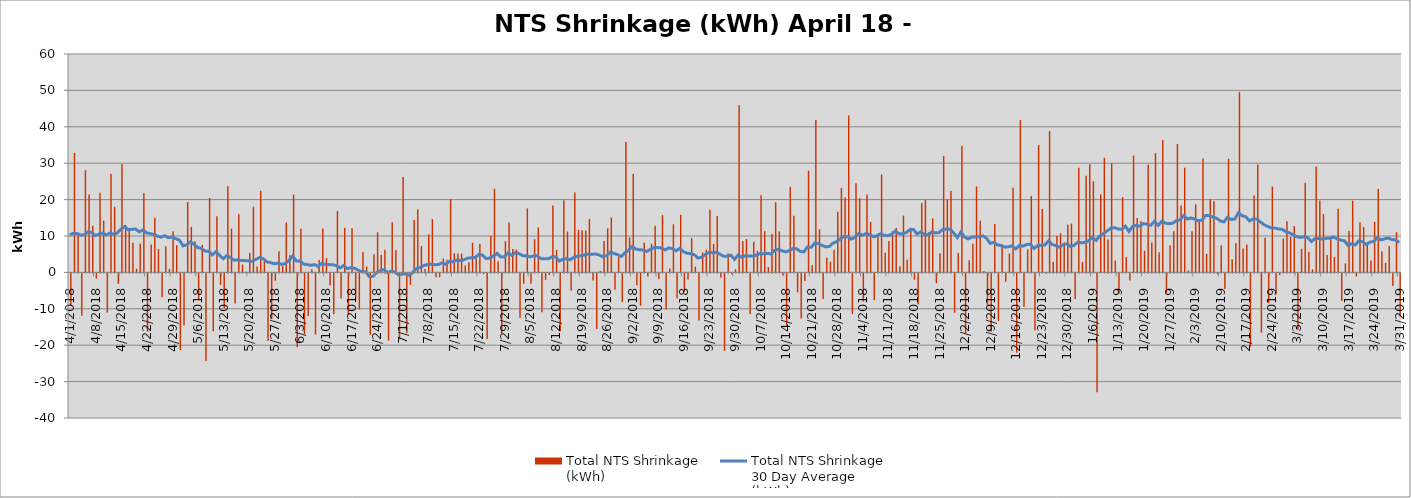
| Category | Total NTS Shrinkage
(kWh) |
|---|---|
| 4/1/18 | -8792530 |
| 4/2/18 | 32834545 |
| 4/3/18 | 10179991 |
| 4/4/18 | -11657593 |
| 4/5/18 | 28062721 |
| 4/6/18 | 21376540 |
| 4/7/18 | 12831044 |
| 4/8/18 | -1435382 |
| 4/9/18 | 21874602 |
| 4/10/18 | 14207387 |
| 4/11/18 | -10780226 |
| 4/12/18 | 27100684 |
| 4/13/18 | 18025390 |
| 4/14/18 | -2851554 |
| 4/15/18 | 29807993 |
| 4/16/18 | 13038217 |
| 4/17/18 | 11923369 |
| 4/18/18 | 8148474 |
| 4/19/18 | 1015356 |
| 4/20/18 | 7866046 |
| 4/21/18 | 21788290 |
| 4/22/18 | -16020216 |
| 4/23/18 | 7645514 |
| 4/24/18 | 15047579 |
| 4/25/18 | 6440771 |
| 4/26/18 | -6556387 |
| 4/27/18 | 7205433 |
| 4/28/18 | 945549 |
| 4/29/18 | 11339143 |
| 4/30/18 | 7467481 |
| 5/1/18 | -21088512 |
| 5/2/18 | -14309737 |
| 5/3/18 | 19314113 |
| 5/4/18 | 12513844 |
| 5/5/18 | 8476117 |
| 5/6/18 | -7231313 |
| 5/7/18 | 7584428 |
| 5/8/18 | -24085678 |
| 5/9/18 | 20438945 |
| 5/10/18 | -15920176 |
| 5/11/18 | 15421669 |
| 5/12/18 | -3150976 |
| 5/13/18 | -9720884 |
| 5/14/18 | 23687402 |
| 5/15/18 | 12031903 |
| 5/16/18 | -8251475 |
| 5/17/18 | 15979781 |
| 5/18/18 | 2153991 |
| 5/19/18 | 184363 |
| 5/20/18 | 5343752 |
| 5/21/18 | 18058094 |
| 5/22/18 | 1641055 |
| 5/23/18 | 22414349 |
| 5/24/18 | 3125869 |
| 5/25/18 | -18588789 |
| 5/26/18 | -12519348 |
| 5/27/18 | -2035233 |
| 5/28/18 | 5834420 |
| 5/29/18 | 1729932 |
| 5/30/18 | 13744297 |
| 5/31/18 | 4684604 |
| 6/1/18 | 21379042 |
| 6/2/18 | -20278760 |
| 6/3/18 | 11986756 |
| 6/4/18 | -16686667 |
| 6/5/18 | -11715027 |
| 6/6/18 | 872239 |
| 6/7/18 | -16791587 |
| 6/8/18 | 3376051 |
| 6/9/18 | 12048019 |
| 6/10/18 | 3911092 |
| 6/11/18 | -3335891 |
| 6/12/18 | -11243322 |
| 6/13/18 | 16888655 |
| 6/14/18 | -6868916 |
| 6/15/18 | 12234463 |
| 6/16/18 | -11335743 |
| 6/17/18 | 12097989 |
| 6/18/18 | -7272961 |
| 6/19/18 | -9910501 |
| 6/20/18 | 5584392 |
| 6/21/18 | 1604414 |
| 6/22/18 | -16865961 |
| 6/23/18 | 4991654 |
| 6/24/18 | 11036590 |
| 6/25/18 | 4880973 |
| 6/26/18 | 6230336 |
| 6/27/18 | -18451515 |
| 6/28/18 | 13772551 |
| 6/29/18 | 6140026 |
| 6/30/18 | -18080453 |
| 7/1/18 | 26241475 |
| 7/2/18 | -16474822 |
| 7/3/18 | -3160652 |
| 7/4/18 | 14371331 |
| 7/5/18 | 17290697 |
| 7/6/18 | 7242451 |
| 7/7/18 | 941301 |
| 7/8/18 | 10453916 |
| 7/9/18 | 14671011 |
| 7/10/18 | -1042026 |
| 7/11/18 | -1051272 |
| 7/12/18 | 3833283 |
| 7/13/18 | 3476910 |
| 7/14/18 | 20109509 |
| 7/15/18 | 5254840 |
| 7/16/18 | 5162329 |
| 7/17/18 | 5137844 |
| 7/18/18 | 1893712 |
| 7/19/18 | 2773134 |
| 7/20/18 | 8146507 |
| 7/21/18 | 4104264 |
| 7/22/18 | 7827355 |
| 7/23/18 | -184575 |
| 7/24/18 | -18015950 |
| 7/25/18 | 9986567 |
| 7/26/18 | 22976449 |
| 7/27/18 | 3037411 |
| 7/28/18 | -16343523 |
| 7/29/18 | 8550423 |
| 7/30/18 | 13703645 |
| 7/31/18 | 6421848 |
| 8/1/18 | 6258830 |
| 8/2/18 | -12188788 |
| 8/3/18 | -2855500 |
| 8/4/18 | 17554029 |
| 8/5/18 | -2845337 |
| 8/6/18 | 9120489 |
| 8/7/18 | 12320566 |
| 8/8/18 | -10645512 |
| 8/9/18 | -1767335 |
| 8/10/18 | -407770 |
| 8/11/18 | 18399787 |
| 8/12/18 | 6185348 |
| 8/13/18 | -15887183 |
| 8/14/18 | 19818877 |
| 8/15/18 | 11233864 |
| 8/16/18 | -4715098 |
| 8/17/18 | 21942572 |
| 8/18/18 | 11697655 |
| 8/19/18 | 11549996 |
| 8/20/18 | 11487185 |
| 8/21/18 | 14726911 |
| 8/22/18 | -1917939 |
| 8/23/18 | -15272931 |
| 8/24/18 | 399506 |
| 8/25/18 | 8655435 |
| 8/26/18 | 12107556 |
| 8/27/18 | 15056486 |
| 8/28/18 | -4513654 |
| 8/29/18 | 4216175 |
| 8/30/18 | -7897329 |
| 8/31/18 | 35826714 |
| 9/1/18 | 9608730 |
| 9/2/18 | 27022549 |
| 9/3/18 | -3240633 |
| 9/4/18 | -8869180 |
| 9/5/18 | 8126625 |
| 9/6/18 | -835503 |
| 9/7/18 | 7883601 |
| 9/8/18 | 12787875 |
| 9/9/18 | -1582848 |
| 9/10/18 | 15736286 |
| 9/11/18 | -9947753 |
| 9/12/18 | 1082880 |
| 9/13/18 | 13222377 |
| 9/14/18 | -6832433 |
| 9/15/18 | 15837461 |
| 9/16/18 | -5034067 |
| 9/17/18 | -1655632 |
| 9/18/18 | 9399716 |
| 9/19/18 | 1568137 |
| 9/20/18 | -12951900 |
| 9/21/18 | 5462340 |
| 9/22/18 | 6240296 |
| 9/23/18 | 17200996 |
| 9/24/18 | 7833984 |
| 9/25/18 | 15494095 |
| 9/26/18 | -1147991 |
| 9/27/18 | -21257782 |
| 9/28/18 | 5180946 |
| 9/29/18 | -255090 |
| 9/30/18 | 846703 |
| 10/1/18 | 45948300 |
| 10/2/18 | 8653339 |
| 10/3/18 | 9188847 |
| 10/4/18 | -11166997 |
| 10/5/18 | 8435426 |
| 10/6/18 | 5943948 |
| 10/7/18 | 21215707 |
| 10/8/18 | 11350171 |
| 10/9/18 | 1458014 |
| 10/10/18 | 10569147 |
| 10/11/18 | 19295146 |
| 10/12/18 | 11289663 |
| 10/13/18 | -559782 |
| 10/14/18 | -14605439 |
| 10/15/18 | 23511898 |
| 10/16/18 | 15543901 |
| 10/17/18 | -5185423 |
| 10/18/18 | -12417747 |
| 10/19/18 | -2087434 |
| 10/20/18 | 27921960 |
| 10/21/18 | 1960650 |
| 10/22/18 | 41854446 |
| 10/23/18 | 11861000 |
| 10/24/18 | -7043359 |
| 10/25/18 | 4031480 |
| 10/26/18 | 2888407 |
| 10/27/18 | 6217038 |
| 10/28/18 | 16657959 |
| 10/29/18 | 23217169 |
| 10/30/18 | 20609035 |
| 10/31/18 | 43128364 |
| 11/1/18 | -11132206 |
| 11/2/18 | 24476851 |
| 11/3/18 | 20388378 |
| 11/4/18 | -7745877 |
| 11/5/18 | 21380456 |
| 11/6/18 | 13830097 |
| 11/7/18 | -7354004 |
| 11/8/18 | 9927632 |
| 11/9/18 | 26893334 |
| 11/10/18 | 5409151 |
| 11/11/18 | 8613909 |
| 11/12/18 | 11319251 |
| 11/13/18 | 12198034 |
| 11/14/18 | 1669932 |
| 11/15/18 | 15600255 |
| 11/16/18 | 3471967 |
| 11/17/18 | 12242375 |
| 11/18/18 | -1740111 |
| 11/19/18 | -8573817 |
| 11/20/18 | 19043247 |
| 11/21/18 | 20002234 |
| 11/22/18 | 11004783 |
| 11/23/18 | 14837649 |
| 11/24/18 | -2675199 |
| 11/25/18 | 5187899 |
| 11/26/18 | 31994128 |
| 11/27/18 | 20102280 |
| 11/28/18 | 22353101 |
| 11/29/18 | -10843739 |
| 11/30/18 | 5315553 |
| 12/1/18 | 34770033 |
| 12/2/18 | -16514033 |
| 12/3/18 | 3370890 |
| 12/4/18 | 7851607 |
| 12/5/18 | 23611964 |
| 12/6/18 | 14223258 |
| 12/7/18 | 359571 |
| 12/8/18 | -8773379 |
| 12/9/18 | -16006803 |
| 12/10/18 | 13309872 |
| 12/11/18 | -13090689 |
| 12/12/18 | 7779131 |
| 12/13/18 | -2325582 |
| 12/14/18 | 5186305 |
| 12/15/18 | 23239572 |
| 12/16/18 | -21798485 |
| 12/17/18 | 41848126 |
| 12/18/18 | -9148526 |
| 12/19/18 | 6329059 |
| 12/20/18 | 20995170 |
| 12/21/18 | -15674375 |
| 12/22/18 | 34994510 |
| 12/23/18 | 17434863 |
| 12/24/18 | -107280 |
| 12/25/18 | 38818588 |
| 12/26/18 | 2947520 |
| 12/27/18 | 10006395 |
| 12/28/18 | 10704664 |
| 12/29/18 | 8196518 |
| 12/30/18 | 13065951 |
| 12/31/18 | 13416581 |
| 1/1/19 | -7067058 |
| 1/2/19 | 28748202 |
| 1/3/19 | 2884169 |
| 1/4/19 | 26581429 |
| 1/5/19 | 29745617 |
| 1/6/19 | 25024327 |
| 1/7/19 | -32667160 |
| 1/8/19 | 21417738 |
| 1/9/19 | 31502820 |
| 1/10/19 | 9054104 |
| 1/11/19 | 29993032 |
| 1/12/19 | 3266911 |
| 1/13/19 | -5617866 |
| 1/14/19 | 20623195 |
| 1/15/19 | 4237008 |
| 1/16/19 | -1931726 |
| 1/17/19 | 32073550 |
| 1/18/19 | 14954981 |
| 1/19/19 | 14046111 |
| 1/20/19 | 5939338 |
| 1/21/19 | 29583872 |
| 1/22/19 | 8241327 |
| 1/23/19 | 32780093 |
| 1/24/19 | 5502134 |
| 1/25/19 | 36399802 |
| 1/26/19 | -5405992 |
| 1/27/19 | 7373923 |
| 1/28/19 | 11317280 |
| 1/29/19 | 35268538 |
| 1/30/19 | 18368586 |
| 1/31/19 | 28758662 |
| 2/1/19 | 543483 |
| 2/2/19 | 11309786 |
| 2/3/19 | 18703961 |
| 2/4/19 | 14618374 |
| 2/5/19 | 31259080 |
| 2/6/19 | 5078492 |
| 2/7/19 | 20073845 |
| 2/8/19 | 19530930 |
| 2/9/19 | -233649 |
| 2/10/19 | 7405253 |
| 2/11/19 | -4316499 |
| 2/12/19 | 31229570 |
| 2/13/19 | 3641145 |
| 2/14/19 | 8094356 |
| 2/15/19 | 49523653 |
| 2/16/19 | 6587519 |
| 2/17/19 | 7666978 |
| 2/18/19 | -20051308 |
| 2/19/19 | 21168166 |
| 2/20/19 | 29669849 |
| 2/21/19 | -16304194 |
| 2/22/19 | 9503489 |
| 2/23/19 | -8166483 |
| 2/24/19 | 23610745 |
| 2/25/19 | -5790426 |
| 2/26/19 | -457856 |
| 2/27/19 | 9302678 |
| 2/28/19 | 14075557 |
| 3/1/19 | 9705339 |
| 3/2/19 | 12648437 |
| 3/3/19 | -15534804 |
| 3/4/19 | 6470289 |
| 3/5/19 | 24625419 |
| 3/6/19 | 5630919 |
| 3/7/19 | 853214 |
| 3/8/19 | 29097972 |
| 3/9/19 | 19781956 |
| 3/10/19 | 16005956 |
| 3/11/19 | 4809548 |
| 3/12/19 | 9709094 |
| 3/13/19 | 4252752 |
| 3/14/19 | 17510064 |
| 3/15/19 | -7551301 |
| 3/16/19 | 2479158 |
| 3/17/19 | 11475907 |
| 3/18/19 | 19713956 |
| 3/19/19 | -855841 |
| 3/20/19 | 13777485 |
| 3/21/19 | 12503465 |
| 3/22/19 | 7568301 |
| 3/23/19 | 3275541 |
| 3/24/19 | 13861924 |
| 3/25/19 | 22939889 |
| 3/26/19 | 5776565 |
| 3/27/19 | 2614115 |
| 3/28/19 | 7221091 |
| 3/29/19 | -3455553 |
| 3/30/19 | 11031290 |
| 3/31/19 | -11899923 |